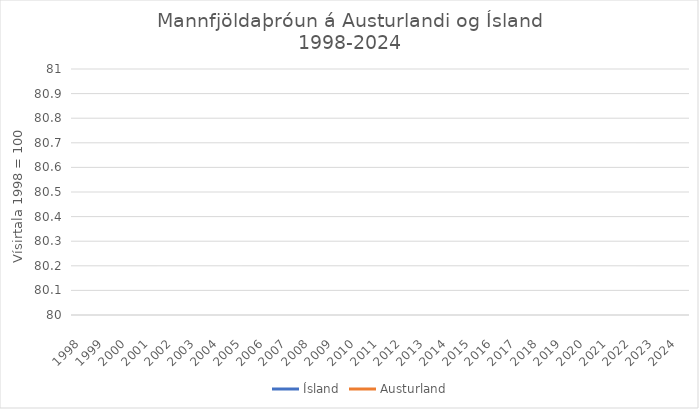
| Category | Ísland | Austurland |
|---|---|---|
| 1998.0 | 100 | 100 |
| 1999.0 | 101.223 | 97.597 |
| 2000.0 | 102.448 | 96.199 |
| 2001.0 | 104.031 | 94.591 |
| 2002.0 | 105.211 | 93.756 |
| 2003.0 | 105.907 | 93.304 |
| 2004.0 | 106.678 | 95.043 |
| 2005.0 | 107.782 | 101.277 |
| 2006.0 | 110.1 | 115.785 |
| 2007.0 | 112.956 | 132.566 |
| 2008.0 | 115.815 | 119.415 |
| 2009.0 | 117.25 | 107.953 |
| 2010.0 | 116.612 | 104.293 |
| 2011.0 | 114.487 | 101.408 |
| 2012.0 | 114.979 | 101.398 |
| 2013.0 | 115.944 | 101.84 |
| 2014.0 | 117.379 | 103.087 |
| 2015.0 | 118.593 | 103.026 |
| 2016.0 | 119.699 | 102.182 |
| 2017.0 | 122.074 | 102.634 |
| 2018.0 | 125.627 | 104.364 |
| 2019.0 | 128.301 | 106.173 |
| 2020.0 | 129.98 | 106.294 |
| 2021.0 | 131.543 | 106.948 |
| 2022.0 | 133.973 | 108.496 |
| 2023.0 | 137.755 | 109.401 |
| 2024.0 | 140.878 | 111.452 |